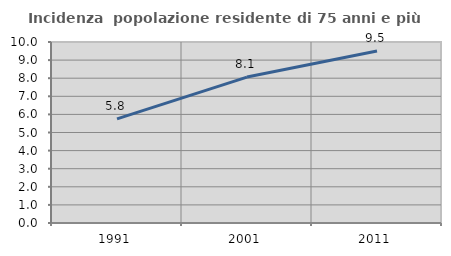
| Category | Incidenza  popolazione residente di 75 anni e più |
|---|---|
| 1991.0 | 5.752 |
| 2001.0 | 8.061 |
| 2011.0 | 9.505 |